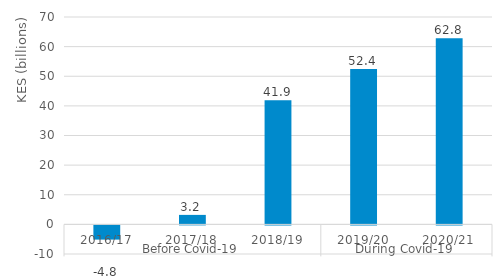
| Category | Basic education |
|---|---|
| 0 | -4.8 |
| 1 | 3.2 |
| 2 | 41.9 |
| 3 | 52.446 |
| 4 | 62.814 |